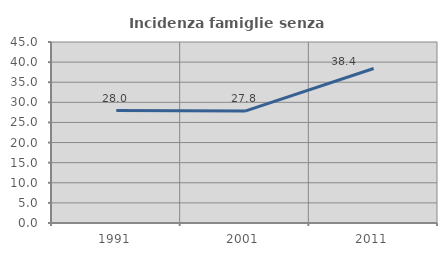
| Category | Incidenza famiglie senza nuclei |
|---|---|
| 1991.0 | 27.95 |
| 2001.0 | 27.815 |
| 2011.0 | 38.411 |